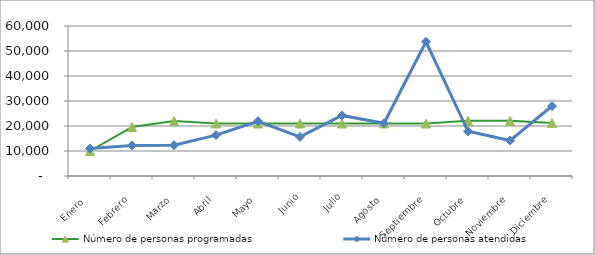
| Category | Número de personas programadas | Número de personas atendidas  |
|---|---|---|
| Enero  | 10000 | 10991 |
| Febrero | 19576 | 12188 |
| Marzo | 22000 | 12318 |
| Abril | 21000 | 16364 |
| Mayo | 21000 | 21901 |
| Junio | 21000 | 15621 |
| Julio | 21000 | 24230 |
| Agosto | 21000 | 21119 |
| Septiembre | 21000 | 53700 |
| Octubre | 22100 | 17881 |
| Noviembre | 22100 | 14175 |
| Diciembre | 21224 | 27989 |